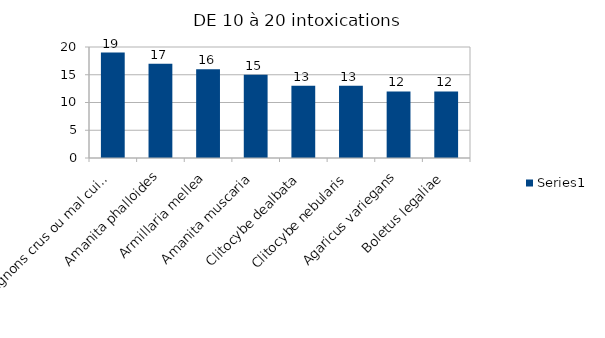
| Category | Series 0 |
|---|---|
| Champignons crus ou mal cuits | 19 |
| Amanita phalloides | 17 |
| Armillaria mellea | 16 |
| Amanita muscaria | 15 |
| Clitocybe dealbata | 13 |
| Clitocybe nebularis | 13 |
| Agaricus variegans | 12 |
| Boletus legaliae | 12 |